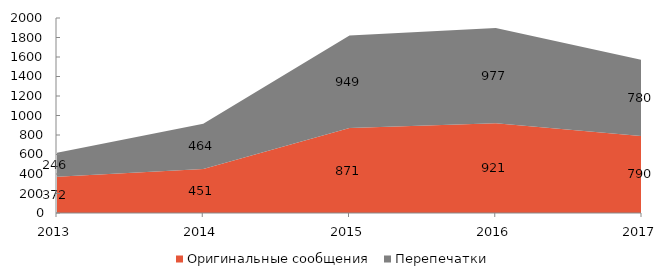
| Category | Оригинальные сообщения | Перепечатки |
|---|---|---|
| 2013 | 372 | 246 |
| 2014 | 451 | 464 |
| 2015 | 871 | 949 |
| 2016 | 921 | 977 |
| 2017 | 790 | 780 |